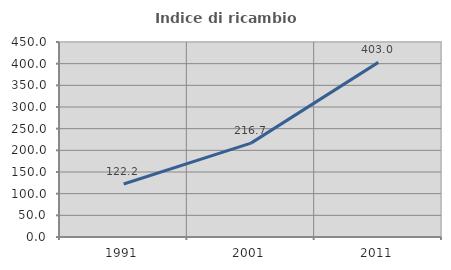
| Category | Indice di ricambio occupazionale  |
|---|---|
| 1991.0 | 122.222 |
| 2001.0 | 216.667 |
| 2011.0 | 403 |